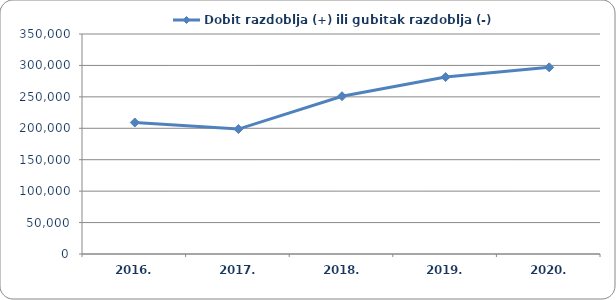
| Category | Dobit razdoblja (+) ili gubitak razdoblja (-)  |
|---|---|
| 2016. | 209158.624 |
| 2017. | 198773.716 |
| 2018. | 250983.665 |
| 2019. | 281446.119 |
| 2020. | 296956.949 |